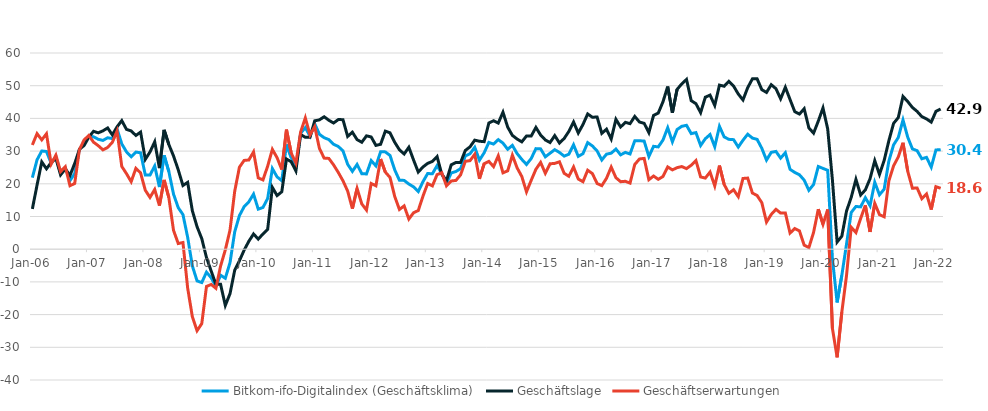
| Category | Bitkom-ifo-Digitalindex (Geschäftsklima) | Geschäftslage | Geschäftserwartungen |
|---|---|---|---|
| 2006-01-01 | 21.878 | 12.306 | 31.882 |
| 2006-02-01 | 27.343 | 19.617 | 35.342 |
| 2006-03-01 | 30.039 | 26.697 | 33.43 |
| 2006-04-01 | 29.883 | 24.592 | 35.3 |
| 2006-05-01 | 26.267 | 26.499 | 26.036 |
| 2006-06-01 | 28.28 | 27.802 | 28.759 |
| 2006-07-01 | 23.231 | 22.724 | 23.739 |
| 2006-08-01 | 24.88 | 24.542 | 25.219 |
| 2006-09-01 | 20.987 | 22.577 | 19.408 |
| 2006-10-01 | 23.152 | 26.237 | 20.11 |
| 2006-11-01 | 30.505 | 30.545 | 30.464 |
| 2006-12-01 | 32.569 | 31.723 | 33.418 |
| 2007-01-01 | 34.546 | 34.293 | 34.798 |
| 2007-02-01 | 34.381 | 36.048 | 32.726 |
| 2007-03-01 | 33.617 | 35.588 | 31.663 |
| 2007-04-01 | 33.267 | 36.195 | 30.376 |
| 2007-05-01 | 34.079 | 37.074 | 31.122 |
| 2007-06-01 | 33.827 | 34.963 | 32.698 |
| 2007-07-01 | 36.769 | 37.43 | 36.11 |
| 2007-08-01 | 32.215 | 39.325 | 25.316 |
| 2007-09-01 | 29.775 | 36.651 | 23.1 |
| 2007-10-01 | 28.277 | 36.177 | 20.642 |
| 2007-11-01 | 29.706 | 34.781 | 24.741 |
| 2007-12-01 | 29.482 | 35.815 | 23.319 |
| 2008-01-01 | 22.692 | 27.471 | 18.013 |
| 2008-02-01 | 22.687 | 29.744 | 15.847 |
| 2008-03-01 | 25.441 | 32.85 | 18.267 |
| 2008-04-01 | 18.993 | 24.799 | 13.336 |
| 2008-05-01 | 28.71 | 36.49 | 21.185 |
| 2008-06-01 | 23.754 | 32.013 | 15.788 |
| 2008-07-01 | 16.83 | 28.509 | 5.749 |
| 2008-08-01 | 12.697 | 24.264 | 1.726 |
| 2008-09-01 | 10.58 | 19.48 | 2.042 |
| 2008-10-01 | 3.64 | 20.441 | -11.88 |
| 2008-11-01 | -5.131 | 11.74 | -20.657 |
| 2008-12-01 | -9.697 | 6.862 | -24.931 |
| 2009-01-01 | -10.202 | 3.231 | -22.747 |
| 2009-02-01 | -7.021 | -2.549 | -11.393 |
| 2009-03-01 | -8.747 | -6.684 | -10.788 |
| 2009-04-01 | -11.347 | -10.744 | -11.949 |
| 2009-05-01 | -7.961 | -10.754 | -5.127 |
| 2009-06-01 | -8.894 | -17.192 | -0.219 |
| 2009-07-01 | -4.129 | -13.605 | 5.829 |
| 2009-08-01 | 5.32 | -6.395 | 17.743 |
| 2009-09-01 | 10.285 | -3.537 | 25.08 |
| 2009-10-01 | 12.994 | -0.283 | 27.153 |
| 2009-11-01 | 14.494 | 2.425 | 27.284 |
| 2009-12-01 | 16.843 | 4.655 | 29.758 |
| 2010-01-01 | 12.247 | 3.091 | 21.816 |
| 2010-02-01 | 12.757 | 4.652 | 21.184 |
| 2010-03-01 | 15.51 | 6.052 | 25.401 |
| 2010-04-01 | 24.641 | 18.905 | 30.528 |
| 2010-05-01 | 22.118 | 16.399 | 27.988 |
| 2010-06-01 | 20.942 | 17.56 | 24.376 |
| 2010-07-01 | 32.021 | 27.58 | 36.548 |
| 2010-08-01 | 28.078 | 26.746 | 29.419 |
| 2010-09-01 | 25.116 | 23.943 | 26.295 |
| 2010-10-01 | 35.447 | 35.08 | 35.815 |
| 2010-11-01 | 37.175 | 34.221 | 40.167 |
| 2010-12-01 | 34.578 | 34.233 | 34.924 |
| 2011-01-01 | 38.364 | 39.263 | 37.468 |
| 2011-02-01 | 35.141 | 39.554 | 30.809 |
| 2011-03-01 | 34.097 | 40.501 | 27.862 |
| 2011-04-01 | 33.519 | 39.425 | 27.759 |
| 2011-05-01 | 32.107 | 38.589 | 25.802 |
| 2011-06-01 | 31.417 | 39.63 | 23.486 |
| 2011-07-01 | 30.086 | 39.621 | 20.93 |
| 2011-08-01 | 25.973 | 34.486 | 17.768 |
| 2011-09-01 | 23.792 | 35.783 | 12.41 |
| 2011-10-01 | 25.916 | 33.508 | 18.571 |
| 2011-11-01 | 23.078 | 32.707 | 13.847 |
| 2011-12-01 | 23.021 | 34.661 | 11.958 |
| 2012-01-01 | 27.1 | 34.325 | 20.098 |
| 2012-02-01 | 25.484 | 31.746 | 19.392 |
| 2012-03-01 | 29.819 | 32.085 | 27.575 |
| 2012-04-01 | 29.76 | 36.107 | 23.583 |
| 2012-05-01 | 28.664 | 35.593 | 21.939 |
| 2012-06-01 | 24.257 | 32.7 | 16.12 |
| 2012-07-01 | 21.084 | 30.394 | 12.15 |
| 2012-08-01 | 21.042 | 29.124 | 13.245 |
| 2012-09-01 | 19.925 | 31.172 | 9.225 |
| 2012-10-01 | 19.071 | 27.286 | 11.153 |
| 2012-11-01 | 17.626 | 23.589 | 11.821 |
| 2012-12-01 | 20.641 | 25.138 | 16.233 |
| 2013-01-01 | 23.142 | 26.25 | 20.077 |
| 2013-02-01 | 23.067 | 26.845 | 19.351 |
| 2013-03-01 | 25.552 | 28.328 | 22.809 |
| 2013-04-01 | 23.141 | 22.909 | 23.373 |
| 2013-05-01 | 20.166 | 20.963 | 19.371 |
| 2013-06-01 | 23.311 | 25.788 | 20.861 |
| 2013-07-01 | 23.762 | 26.529 | 21.029 |
| 2013-08-01 | 24.642 | 26.549 | 22.751 |
| 2013-09-01 | 28.531 | 30.189 | 26.885 |
| 2013-10-01 | 29.184 | 31.311 | 27.076 |
| 2013-11-01 | 31.174 | 33.347 | 29.021 |
| 2013-12-01 | 27.205 | 33.017 | 21.539 |
| 2014-01-01 | 29.484 | 32.887 | 26.13 |
| 2014-02-01 | 32.647 | 38.589 | 26.854 |
| 2014-03-01 | 32.159 | 39.277 | 25.252 |
| 2014-04-01 | 33.51 | 38.572 | 28.556 |
| 2014-05-01 | 32.439 | 41.897 | 23.351 |
| 2014-06-01 | 30.561 | 37.35 | 23.966 |
| 2014-07-01 | 31.755 | 34.801 | 28.749 |
| 2014-08-01 | 29.247 | 33.694 | 24.886 |
| 2014-09-01 | 27.468 | 32.826 | 22.233 |
| 2014-10-01 | 25.918 | 34.618 | 17.54 |
| 2014-11-01 | 27.739 | 34.604 | 21.076 |
| 2014-12-01 | 30.755 | 37.24 | 24.448 |
| 2015-01-01 | 30.683 | 34.904 | 26.537 |
| 2015-02-01 | 28.254 | 33.405 | 23.217 |
| 2015-03-01 | 29.347 | 32.623 | 26.118 |
| 2015-04-01 | 30.443 | 34.729 | 26.236 |
| 2015-05-01 | 29.588 | 32.479 | 26.733 |
| 2015-06-01 | 28.469 | 33.847 | 23.215 |
| 2015-07-01 | 29.053 | 36.017 | 22.293 |
| 2015-08-01 | 31.919 | 38.896 | 25.145 |
| 2015-09-01 | 28.388 | 35.535 | 21.458 |
| 2015-10-01 | 29.219 | 38.129 | 20.643 |
| 2015-11-01 | 32.594 | 41.36 | 24.147 |
| 2015-12-01 | 31.577 | 40.353 | 23.121 |
| 2016-01-01 | 30.042 | 40.432 | 20.101 |
| 2016-02-01 | 27.291 | 35.43 | 19.433 |
| 2016-03-01 | 29.07 | 36.697 | 21.689 |
| 2016-04-01 | 29.364 | 33.696 | 25.113 |
| 2016-05-01 | 30.621 | 39.719 | 21.869 |
| 2016-06-01 | 28.856 | 37.372 | 20.645 |
| 2016-07-01 | 29.602 | 38.795 | 20.763 |
| 2016-08-01 | 29.121 | 38.39 | 20.212 |
| 2016-09-01 | 33.133 | 40.599 | 25.899 |
| 2016-10-01 | 33.175 | 38.898 | 27.589 |
| 2016-11-01 | 33.065 | 38.49 | 27.763 |
| 2016-12-01 | 28.345 | 35.663 | 21.255 |
| 2017-01-01 | 31.461 | 40.917 | 22.377 |
| 2017-02-01 | 31.283 | 41.646 | 21.365 |
| 2017-03-01 | 33.384 | 45.092 | 22.235 |
| 2017-04-01 | 37.135 | 49.742 | 25.165 |
| 2017-05-01 | 32.833 | 41.744 | 24.25 |
| 2017-06-01 | 36.607 | 48.877 | 24.941 |
| 2017-07-01 | 37.584 | 50.571 | 25.27 |
| 2017-08-01 | 37.889 | 51.918 | 24.641 |
| 2017-09-01 | 35.343 | 45.417 | 25.682 |
| 2017-10-01 | 35.656 | 44.508 | 27.125 |
| 2017-11-01 | 31.72 | 41.763 | 22.094 |
| 2017-12-01 | 33.793 | 46.488 | 21.752 |
| 2018-01-01 | 35.065 | 47.124 | 23.594 |
| 2018-02-01 | 31.339 | 43.969 | 19.363 |
| 2018-03-01 | 37.565 | 50.188 | 25.579 |
| 2018-04-01 | 34.338 | 49.838 | 19.8 |
| 2018-05-01 | 33.597 | 51.348 | 17.099 |
| 2018-06-01 | 33.5 | 49.888 | 18.186 |
| 2018-07-01 | 31.233 | 47.457 | 16.073 |
| 2018-08-01 | 33.327 | 45.642 | 21.629 |
| 2018-09-01 | 35.166 | 49.399 | 21.746 |
| 2018-10-01 | 33.982 | 52.089 | 17.177 |
| 2018-11-01 | 33.584 | 52.108 | 16.422 |
| 2018-12-01 | 30.858 | 48.787 | 14.222 |
| 2019-01-01 | 27.257 | 47.939 | 8.301 |
| 2019-02-01 | 29.614 | 50.312 | 10.627 |
| 2019-03-01 | 29.903 | 49.094 | 12.19 |
| 2019-04-01 | 27.853 | 45.996 | 11.048 |
| 2019-05-01 | 29.507 | 49.527 | 11.094 |
| 2019-06-01 | 24.426 | 45.772 | 4.934 |
| 2019-07-01 | 23.483 | 42.072 | 6.321 |
| 2019-08-01 | 22.751 | 41.324 | 5.606 |
| 2019-09-01 | 21.124 | 42.956 | 1.253 |
| 2019-10-01 | 18.017 | 37.081 | 0.486 |
| 2019-11-01 | 19.79 | 35.49 | 5.137 |
| 2019-12-01 | 25.3 | 39.17 | 12.234 |
| 2020-01-01 | 24.703 | 43.194 | 7.618 |
| 2020-02-01 | 24.124 | 36.784 | 12.142 |
| 2020-03-01 | -2.794 | 21.221 | -24.202 |
| 2020-04-01 | -16.278 | 2.195 | -33.063 |
| 2020-05-01 | -7.995 | 3.98 | -19.268 |
| 2020-06-01 | 1.568 | 11.671 | -8.053 |
| 2020-07-01 | 11.239 | 15.862 | 6.715 |
| 2020-08-01 | 13.065 | 21.345 | 5.094 |
| 2020-09-01 | 12.946 | 16.576 | 9.376 |
| 2020-10-01 | 15.753 | 18.13 | 13.402 |
| 2020-11-01 | 13.277 | 21.568 | 5.296 |
| 2020-12-01 | 20.456 | 27.075 | 14.031 |
| 2021-01-01 | 16.629 | 22.873 | 10.56 |
| 2021-02-01 | 18.363 | 27.156 | 9.911 |
| 2021-03-01 | 26.972 | 33.198 | 20.911 |
| 2021-04-01 | 31.915 | 38.478 | 25.532 |
| 2021-05-01 | 34.157 | 40.254 | 28.215 |
| 2021-06-01 | 39.531 | 46.717 | 32.555 |
| 2021-07-01 | 34.268 | 45.155 | 23.864 |
| 2021-08-01 | 30.669 | 43.347 | 18.652 |
| 2021-09-01 | 30.129 | 42.136 | 18.718 |
| 2021-10-01 | 27.654 | 40.542 | 15.457 |
| 2021-11-01 | 28.083 | 39.846 | 16.896 |
| 2021-12-01 | 25.096 | 38.865 | 12.121 |
| 2022-01-01 | 30.352 | 42.156 | 19.124 |
| 2022-02-01 | 30.437 | 42.89 | 18.622 |